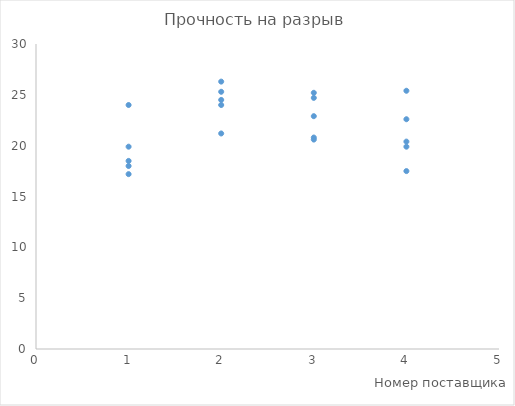
| Category | Прочность на разрыв |
|---|---|
| 1.0 | 18.5 |
| 1.0 | 24 |
| 1.0 | 17.2 |
| 1.0 | 19.9 |
| 1.0 | 18 |
| 2.0 | 26.3 |
| 2.0 | 25.3 |
| 2.0 | 24 |
| 2.0 | 21.2 |
| 2.0 | 24.5 |
| 3.0 | 20.6 |
| 3.0 | 25.2 |
| 3.0 | 20.8 |
| 3.0 | 24.7 |
| 3.0 | 22.9 |
| 4.0 | 25.4 |
| 4.0 | 19.9 |
| 4.0 | 22.6 |
| 4.0 | 17.5 |
| 4.0 | 20.4 |